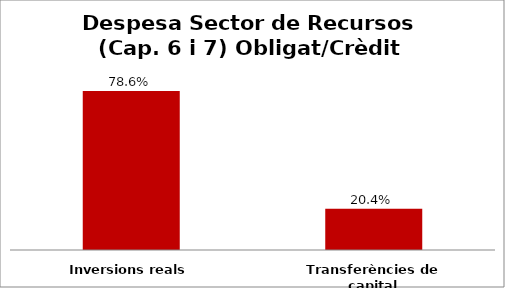
| Category | Series 0 |
|---|---|
| Inversions reals | 0.786 |
| Transferències de capital | 0.204 |